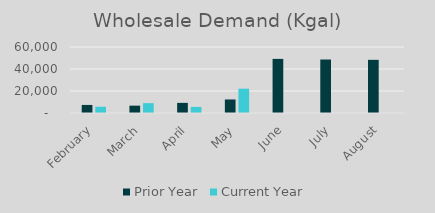
| Category | Prior Year | Current Year |
|---|---|---|
| February | 7328 | 5662 |
| March | 6673 | 8964 |
| April | 9201 | 5557 |
| May | 12299 | 22105 |
| June | 49180 | 0 |
| July | 48620 | 0 |
| August | 48323 | 0 |